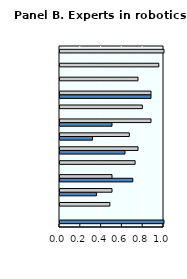
| Category | physical | reasoning/language |
|---|---|---|
| 0 | 1 | 0 |
| 1 | 0 | 0.479 |
| 2 | 0.35 | 0.5 |
| 3 | 0.7 | 0.5 |
| 4 | 0 | 0.722 |
| 5 | 0.625 | 0.75 |
| 6 | 0.312 | 0.667 |
| 7 | 0.5 | 0.875 |
| 8 | 0 | 0.792 |
| 9 | 0.875 | 0.875 |
| 10 | 0 | 0.75 |
| 11 | 0 | 0.95 |
| 12 | 0 | 1 |